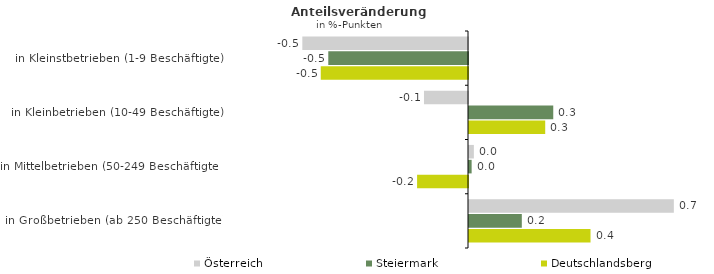
| Category | Österreich | Steiermark | Deutschlandsberg |
|---|---|---|---|
| in Kleinstbetrieben (1-9 Beschäftigte) | -0.55 | -0.464 | -0.489 |
| in Kleinbetrieben (10-49 Beschäftigte) | -0.146 | 0.28 | 0.253 |
| in Mittelbetrieben (50-249 Beschäftigte) | 0.016 | 0.009 | -0.169 |
| in Großbetrieben (ab 250 Beschäftigte) | 0.68 | 0.175 | 0.403 |